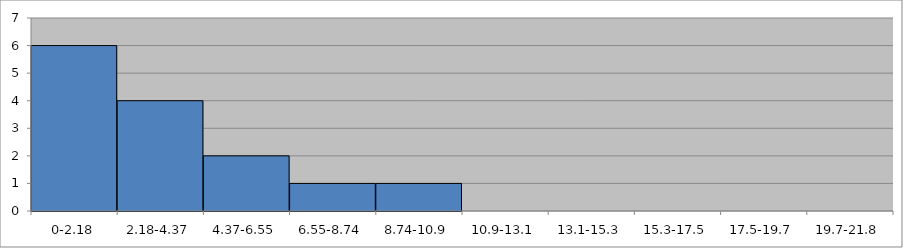
| Category | Series 0 |
|---|---|
| 0-2.18 | 6 |
| 2.18-4.37 | 4 |
| 4.37-6.55 | 2 |
| 6.55-8.74 | 1 |
| 8.74-10.9 | 1 |
| 10.9-13.1 | 0 |
| 13.1-15.3 | 0 |
| 15.3-17.5 | 0 |
| 17.5-19.7 | 0 |
| 19.7-21.8 | 0 |